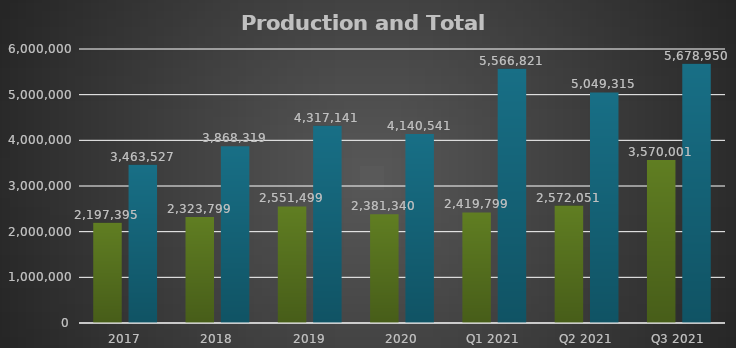
| Category | Production Ha | Total Ha* |
|---|---|---|
| 2017 | 2197395 | 3463527.49 |
| 2018 | 2323798.97 | 3868318.93 |
| 2019 | 2551499 | 4317141 |
| 2020 | 2381340.48 | 4140541.15 |
| Q1 2021 | 2419799 | 5566821.43 |
| Q2 2021 | 2572051 | 5049314.77 |
| Q3 2021 | 3570001 | 5678950 |